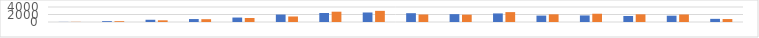
| Category | Series 0 | Series 1 |
|---|---|---|
| 7:00-8:00 | 28 | 48 |
| 8:00-9:00 | 220 | 212 |
| 9:00-10:00 | 596 | 448 |
| 10:00-11:00 | 788 | 748 |
| 11:00-12:00 | 1188 | 1068 |
| 12:00-13:00 | 1988 | 1472 |
| 13:00-14:00 | 2396 | 2748 |
| 14:00-15:00 | 2536 | 2972 |
| 15:00-16:00 | 2348 | 2004 |
| 16:00-17:00 | 2096 | 1948 |
| 17:00-18:00 | 2284 | 2636 |
| 18:00-19:00 | 1708 | 2048 |
| 19:00-20:00 | 1748 | 2204 |
| 20:00-21:00 | 1604 | 2048 |
| 21:00-22:00 | 1680 | 2004 |
| 22:00-23:00 | 840 | 788 |